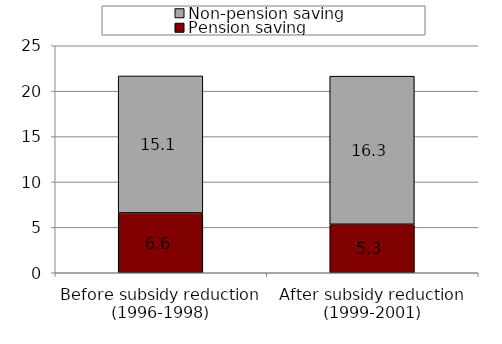
| Category | Pension saving | Non-pension saving |
|---|---|---|
| Before subsidy reduction (1996-1998) | 6.591 | 15.086 |
| After subsidy reduction (1999-2001) | 5.343 | 16.309 |